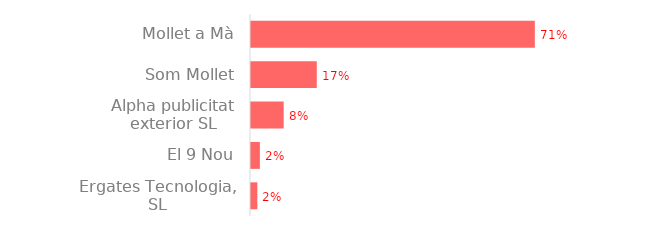
| Category | Series 0 |
|---|---|
| Mollet a Mà | 13559.96 |
| Som Mollet | 3142.11 |
| Alpha publicitat exterior SL | 1560.9 |
| El 9 Nou | 423.5 |
| Ergates Tecnologia, SL | 302.5 |